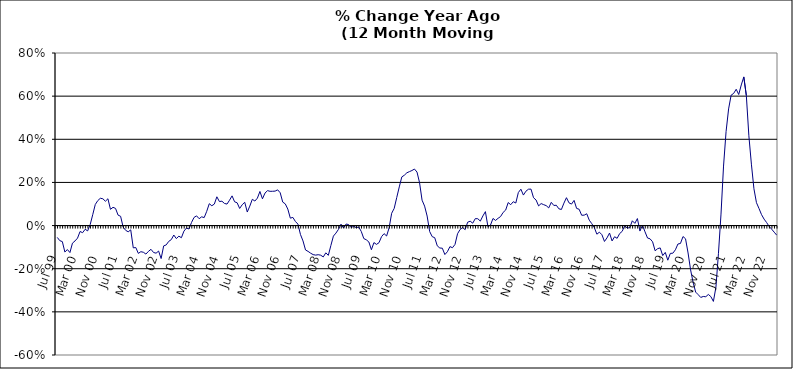
| Category | Series 0 |
|---|---|
| Jul 99 | -0.055 |
| Aug 99 | -0.07 |
| Sep 99 | -0.074 |
| Oct 99 | -0.123 |
| Nov 99 | -0.111 |
| Dec 99 | -0.125 |
| Jan 00 | -0.082 |
| Feb 00 | -0.071 |
| Mar 00 | -0.058 |
| Apr 00 | -0.027 |
| May 00 | -0.033 |
| Jun 00 | -0.017 |
| Jul 00 | -0.025 |
| Aug 00 | 0.005 |
| Sep 00 | 0.05 |
| Oct 00 | 0.098 |
| Nov 00 | 0.116 |
| Dec 00 | 0.127 |
| Jan 01 | 0.124 |
| Feb 01 | 0.113 |
| Mar 01 | 0.124 |
| Apr 01 | 0.075 |
| May 01 | 0.085 |
| Jun 01 | 0.08 |
| Jul 01 | 0.048 |
| Aug 01 | 0.043 |
| Sep 01 | -0.007 |
| Oct 01 | -0.022 |
| Nov 01 | -0.029 |
| Dec 01 | -0.02 |
| Jan 02 | -0.103 |
| Feb 02 | -0.102 |
| Mar 02 | -0.129 |
| Apr 02 | -0.121 |
| May 02 | -0.124 |
| Jun 02 | -0.132 |
| Jul 02 | -0.119 |
| Aug 02 | -0.11 |
| Sep 02 | -0.125 |
| Oct 02 | -0.128 |
| Nov 02 | -0.118 |
| Dec 02 | -0.153 |
| Jan 03 | -0.094 |
| Feb 03 | -0.09 |
| Mar 03 | -0.073 |
| Apr 03 | -0.065 |
| May 03 | -0.044 |
| Jun 03 | -0.06 |
| Jul 03 | -0.049 |
| Aug 03 | -0.056 |
| Sep 03 | -0.026 |
| Oct 03 | -0.012 |
| Nov 03 | -0.016 |
| Dec 03 | 0.014 |
| Jan 04 | 0.038 |
| Feb 04 | 0.045 |
| Mar 04 | 0.032 |
| Apr 04 | 0.041 |
| May 04 | 0.037 |
| Jun 04 | 0.066 |
| Jul 04 | 0.101 |
| Aug 04 | 0.092 |
| Sep 04 | 0.1 |
| Oct 04 | 0.133 |
| Nov 04 | 0.111 |
| Dec 04 | 0.113 |
| Jan 05 | 0.103 |
| Feb 05 | 0.1 |
| Mar 05 | 0.118 |
| Apr 05 | 0.138 |
| May 05 | 0.11 |
| Jun 05 | 0.106 |
| Jul 05 | 0.079 |
| Aug 05 | 0.097 |
| Sep 05 | 0.108 |
| Oct 05 | 0.063 |
| Nov 05 | 0.09 |
| Dec 05 | 0.122 |
| Jan 06 | 0.114 |
| Feb 06 | 0.127 |
| Mar 06 | 0.158 |
| Apr 06 | 0.124 |
| May 06 | 0.151 |
| Jun 06 | 0.162 |
| Jul 06 | 0.159 |
| Aug 06 | 0.159 |
| Sep 06 | 0.16 |
| Oct 06 | 0.166 |
| Nov 06 | 0.152 |
| Dec 06 | 0.109 |
| Jan 07 | 0.101 |
| Feb 07 | 0.076 |
| Mar 07 | 0.034 |
| Apr 07 | 0.038 |
| May 07 | 0.019 |
| Jun 07 | 0.007 |
| Jul 07 | -0.041 |
| Aug 07 | -0.071 |
| Sep 07 | -0.113 |
| Oct 07 | -0.12 |
| Nov 07 | -0.128 |
| Dec 07 | -0.135 |
| Jan 08 | -0.137 |
| Feb 08 | -0.135 |
| Mar 08 | -0.137 |
| Apr 08 | -0.145 |
| May 08 | -0.126 |
| Jun 08 | -0.138 |
| Jul 08 | -0.093 |
| Aug 08 | -0.049 |
| Sep-08 | -0.035 |
| Oct 08 | -0.018 |
| Nov 08 | 0.007 |
| Dec 08 | -0.011 |
| Jan 09 | 0.007 |
| Feb 09 | 0.005 |
| Mar 09 | -0.009 |
| Apr 09 | -0.003 |
| May 09 | -0.01 |
| Jun 09 | -0.007 |
| Jul 09 | -0.027 |
| Aug 09 | -0.06 |
| Sep 09 | -0.066 |
| Oct 09 | -0.076 |
| Nov 09 | -0.112 |
| Dec 09 | -0.079 |
| Jan 10 | -0.087 |
| Feb 10 | -0.079 |
| Mar 10 | -0.052 |
| Apr 10 | -0.037 |
| May 10 | -0.048 |
| Jun 10 | -0.01 |
| Jul 10 | 0.057 |
| Aug 10 | 0.08 |
| Sep 10 | 0.13 |
| Oct 10 | 0.179 |
| Nov 10 | 0.226 |
| Dec 10 | 0.233 |
| Jan 11 | 0.245 |
| Feb 11 | 0.25 |
| Mar 11 | 0.255 |
| Apr 11 | 0.262 |
| May 11 | 0.248 |
| Jun 11 | 0.199 |
| Jul 11 | 0.118 |
| Aug 11 | 0.09 |
| Sep 11 | 0.044 |
| Oct 11 | -0.028 |
| Nov 11 | -0.051 |
| Dec 11 | -0.056 |
| Jan 12 | -0.094 |
| Feb 12 | -0.104 |
| Mar 12 | -0.105 |
| Apr 12 | -0.134 |
| May 12 | -0.121 |
| Jun 12 | -0.098 |
| Jul 12 | -0.103 |
| Aug 12 | -0.087 |
| Sep 12 | -0.038 |
| Oct 12 | -0.018 |
| Nov 12 | -0.009 |
| Dec 12 | -0.019 |
| Jan 13 | 0.016 |
| Feb-13 | 0.02 |
| Mar-13 | 0.011 |
| Apr 13 | 0.032 |
| May 13 | 0.032 |
| Jun-13 | 0.021 |
| Jul 13 | 0.045 |
| Aug 13 | 0.065 |
| Sep 13 | -0.005 |
| Oct 13 | 0.002 |
| Nov 13 | 0.033 |
| Dec 13 | 0.024 |
| Jan 14 | 0.034 |
| Feb-14 | 0.042 |
| Mar 14 | 0.061 |
| Apr 14 | 0.072 |
| May 14 | 0.107 |
| Jun 14 | 0.097 |
| Jul-14 | 0.111 |
| Aug-14 | 0.105 |
| Sep 14 | 0.153 |
| Oct 14 | 0.169 |
| Nov 14 | 0.141 |
| Dec 14 | 0.159 |
| Jan 15 | 0.169 |
| Feb 15 | 0.169 |
| Mar 15 | 0.129 |
| Apr-15 | 0.118 |
| May 15 | 0.091 |
| Jun-15 | 0.102 |
| Jul 15 | 0.097 |
| Aug 15 | 0.092 |
| Sep 15 | 0.082 |
| Oct 15 | 0.108 |
| Nov 15 | 0.093 |
| Dec 15 | 0.094 |
| Jan 16 | 0.078 |
| Feb 16 | 0.075 |
| Mar 16 | 0.104 |
| Apr 16 | 0.129 |
| May 16 | 0.105 |
| Jun 16 | 0.1 |
| Jul 16 | 0.117 |
| Aug 16 | 0.08 |
| Sep 16 | 0.076 |
| Oct 16 | 0.048 |
| Nov 16 | 0.048 |
| Dec 16 | 0.055 |
| Jan 17 | 0.025 |
| Feb 17 | 0.009 |
| Mar 17 | -0.01 |
| Apr 17 | -0.04 |
| May 17 | -0.031 |
| Jun 17 | -0.042 |
| Jul 17 | -0.074 |
| Aug 17 | -0.057 |
| Sep 17 | -0.035 |
| Oct 17 | -0.071 |
| Nov 17 | -0.052 |
| Dec 17 | -0.059 |
| Jan 18 | -0.037 |
| Feb 18 | -0.027 |
| Mar 18 | 0 |
| Apr 18 | -0.012 |
| May 18 | -0.009 |
| Jun 18 | 0.022 |
| Jul 18 | 0.01 |
| Aug 18 | 0.033 |
| Sep 18 | -0.025 |
| Oct 18 | 0.002 |
| Nov 18 | -0.029 |
| Dec 18 | -0.058 |
| Jan 19 | -0.061 |
| Feb 19 | -0.075 |
| Mar 19 | -0.117 |
| Apr 19 | -0.107 |
| May 19 | -0.104 |
| Jun 19 | -0.139 |
| Jul 19 | -0.124 |
| Aug 19 | -0.16 |
| Sep 19 | -0.129 |
| Oct 19 | -0.128 |
| Nov 19 | -0.112 |
| Dec 19 | -0.085 |
| Jan 20 | -0.083 |
| Feb 20 | -0.051 |
| Mar 20 | -0.061 |
| Apr 20 | -0.127 |
| May 20 | -0.206 |
| Jun 20 | -0.264 |
| Jul 20 | -0.308 |
| Aug 20 | -0.32 |
| Sep 20 | -0.333 |
| Oct 20 | -0.329 |
| Nov 20 | -0.33 |
| Dec 20 | -0.319 |
| Jan 21 | -0.329 |
| Feb 21 | -0.352 |
| Mar 21 | -0.286 |
| Apr 21 | -0.129 |
| May 21 | 0.053 |
| Jun 21 | 0.276 |
| Jul 21 | 0.435 |
| Aug 21 | 0.541 |
| Sep 21 | 0.604 |
| Oct 21 | 0.613 |
| Nov 21 | 0.632 |
| Dec 21 | 0.608 |
| Jan 22 | 0.652 |
| Feb 22 | 0.689 |
| Mar 22 | 0.603 |
| Apr 22 | 0.416 |
| May 22 | 0.285 |
| Jun 22 | 0.171 |
| Jul 22 | 0.106 |
| Aug 22 | 0.079 |
| Sep 22 | 0.051 |
| Oct 22 | 0.03 |
| Nov 22 | 0.014 |
| Dec 22 | -0.004 |
| Jan 23 | -0.017 |
| Feb 23 | -0.031 |
| Mar 23 | -0.045 |